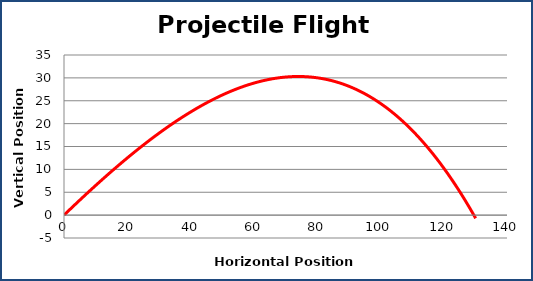
| Category | Position |
|---|---|
| 0.0 | 0 |
| 0.3653488391369297 | 0.243 |
| 0.7298941855221637 | 0.486 |
| 1.0936411116248594 | 0.727 |
| 1.456594636738926 | 0.968 |
| 1.818759727760791 | 1.207 |
| 2.1801412999525915 | 1.445 |
| 2.540744217691124 | 1.683 |
| 2.900573295202874 | 1.919 |
| 3.2596332972854447 | 2.155 |
| 3.617928940015685 | 2.389 |
| 3.975464891444821 | 2.623 |
| 4.332245772280883 | 2.855 |
| 4.6882761565586994 | 3.087 |
| 5.043560572297749 | 3.318 |
| 5.398103502148127 | 3.547 |
| 5.751909384024897 | 3.776 |
| 6.104982611731068 | 4.003 |
| 6.457327535569466 | 4.23 |
| 6.808948462943725 | 4.456 |
| 7.159849658948631 | 4.681 |
| 7.510035346950067 | 4.904 |
| 7.859509709154763 | 5.127 |
| 8.208276887170086 | 5.349 |
| 8.556340982554058 | 5.57 |
| 8.903706057355839 | 5.789 |
| 9.250376134646855 | 6.008 |
| 9.596355199042785 | 6.226 |
| 9.941647197216573 | 6.443 |
| 10.286256038402684 | 6.659 |
| 10.63018559489276 | 6.874 |
| 10.97343970252288 | 7.088 |
| 11.316022161152567 | 7.301 |
| 11.65793673513574 | 7.512 |
| 11.99918715378376 | 7.723 |
| 12.339777111820737 | 7.933 |
| 12.679710269831252 | 8.142 |
| 13.018990254700663 | 8.35 |
| 13.35762066004811 | 8.558 |
| 13.695605046652405 | 8.764 |
| 14.03294694287094 | 8.969 |
| 14.369649845051722 | 9.173 |
| 14.705717217938718 | 9.376 |
| 15.041152495070609 | 9.578 |
| 15.375959079173105 | 9.779 |
| 15.71014034254492 | 9.979 |
| 16.043699627437565 | 10.179 |
| 16.37664024642907 | 10.377 |
| 16.70896548279172 | 10.574 |
| 17.04067859085398 | 10.77 |
| 17.371782796356673 | 10.966 |
| 17.70228129680354 | 11.16 |
| 18.032177261806304 | 11.353 |
| 18.361473833424295 | 11.546 |
| 18.69017412649882 | 11.737 |
| 19.018281228982293 | 11.927 |
| 19.345798202262277 | 12.117 |
| 19.672728081480525 | 12.305 |
| 19.999073875847102 | 12.493 |
| 20.32483856894968 | 12.679 |
| 20.650025119058128 | 12.864 |
| 20.97463645942443 | 13.049 |
| 21.298675498578067 | 13.232 |
| 21.62214512061692 | 13.415 |
| 21.9450481854938 | 13.596 |
| 22.267387529298638 | 13.777 |
| 22.589165964536484 | 13.957 |
| 22.91038628040132 | 14.135 |
| 23.231051243045822 | 14.313 |
| 23.551163595847118 | 14.489 |
| 23.870726059668588 | 14.665 |
| 24.189741333117837 | 14.84 |
| 24.508212092800886 | 15.014 |
| 24.826140993572547 | 15.186 |
| 25.143530668783388 | 15.358 |
| 25.46038373052275 | 15.529 |
| 25.77670276985841 | 15.698 |
| 26.092490357073068 | 15.867 |
| 26.40774904189685 | 16.035 |
| 26.722481353736924 | 16.202 |
| 27.03668980190366 | 16.368 |
| 27.350376875833568 | 16.533 |
| 27.663545045309096 | 16.697 |
| 27.976196760675283 | 16.859 |
| 28.28833445305338 | 17.021 |
| 28.599960534551418 | 17.182 |
| 28.911077398471853 | 17.342 |
| 29.221687419516304 | 17.501 |
| 29.531792953987402 | 17.659 |
| 29.841396339987863 | 17.816 |
| 30.150499897616783 | 17.972 |
| 30.45910592916322 | 18.127 |
| 30.767216719297103 | 18.281 |
| 31.07483453525753 | 18.434 |
| 31.381961627038468 | 18.587 |
| 31.688600227571932 | 18.738 |
| 31.994752552908658 | 18.888 |
| 32.300420802396324 | 19.037 |
| 32.60560715885536 | 19.185 |
| 32.91031378875239 | 19.332 |
| 33.21454284237133 | 19.479 |
| 33.51829645398223 | 19.624 |
| 33.821576742007686 | 19.768 |
| 34.12438580918737 | 19.911 |
| 34.426725742740054 | 20.054 |
| 34.72859861452359 | 20.195 |
| 35.03000648119284 | 20.335 |
| 35.330951384355444 | 20.475 |
| 35.63143535072557 | 20.613 |
| 35.93146039227564 | 20.751 |
| 36.2310285063861 | 20.887 |
| 36.53014167599323 | 21.022 |
| 36.82880186973497 | 21.157 |
| 37.127011042094956 | 21.29 |
| 37.42477113354466 | 21.423 |
| 37.72208407068364 | 21.554 |
| 38.018951766378095 | 21.685 |
| 38.315376119897536 | 21.814 |
| 38.6113590170498 | 21.943 |
| 38.90690233031431 | 22.071 |
| 39.20200791897363 | 22.197 |
| 39.49667762924336 | 22.323 |
| 39.79091329440042 | 22.447 |
| 40.084716734909684 | 22.571 |
| 40.37808975854904 | 22.694 |
| 40.67103416053288 | 22.816 |
| 40.963551723634055 | 22.936 |
| 41.255644218304305 | 23.056 |
| 41.547313402793186 | 23.175 |
| 41.83856102326555 | 23.293 |
| 42.12938881391754 | 23.409 |
| 42.41979849709118 | 23.525 |
| 42.70979178338757 | 23.64 |
| 42.99937037177866 | 23.754 |
| 43.28853594971767 | 23.867 |
| 43.57729019324818 | 23.979 |
| 43.8656347671119 | 24.089 |
| 44.15357132485509 | 24.199 |
| 44.44110150893376 | 24.308 |
| 44.72822695081753 | 24.416 |
| 45.0149492710923 | 24.523 |
| 45.30127007956166 | 24.629 |
| 45.587190975347134 | 24.734 |
| 45.872713546987114 | 24.838 |
| 46.15783937253476 | 24.941 |
| 46.442570019654646 | 25.044 |
| 46.7269070457183 | 25.145 |
| 47.010851997898605 | 25.245 |
| 47.29440641326308 | 25.344 |
| 47.57757181886611 | 25.442 |
| 47.860349731840024 | 25.539 |
| 48.142741659485175 | 25.635 |
| 48.42474909935895 | 25.731 |
| 48.70637353936372 | 25.825 |
| 48.987616457833816 | 25.918 |
| 49.26847932362148 | 26.01 |
| 49.54896359618179 | 26.102 |
| 49.8290707256567 | 26.192 |
| 50.10880215295799 | 26.281 |
| 50.38815930984941 | 26.37 |
| 50.66714361902773 | 26.457 |
| 50.945756494203046 | 26.543 |
| 51.22399934017799 | 26.629 |
| 51.5018735529262 | 26.713 |
| 51.779380519669786 | 26.797 |
| 52.056521618956026 | 26.879 |
| 52.3332982207331 | 26.961 |
| 52.609711686425044 | 27.041 |
| 52.88576336900586 | 27.121 |
| 53.16145461307276 | 27.199 |
| 53.43678675491864 | 27.277 |
| 53.71176112260372 | 27.353 |
| 53.986379036026385 | 27.429 |
| 54.26064180699331 | 27.504 |
| 54.53455073928871 | 27.577 |
| 54.808107128742904 | 27.65 |
| 55.081312263300106 | 27.721 |
| 55.354167423085464 | 27.792 |
| 55.626673880471394 | 27.862 |
| 55.898832900143155 | 27.931 |
| 56.170645739163746 | 27.998 |
| 56.44211364703808 | 28.065 |
| 56.71323786577648 | 28.131 |
| 56.98401962995747 | 28.196 |
| 57.254460166789926 | 28.259 |
| 57.5245606961745 | 28.322 |
| 57.79432243076445 | 28.384 |
| 58.06374657602581 | 28.445 |
| 58.33283433029685 | 28.505 |
| 58.601586884847016 | 28.564 |
| 58.870005423935154 | 28.622 |
| 59.13809112486717 | 28.679 |
| 59.40584515805303 | 28.735 |
| 59.67326868706326 | 28.79 |
| 59.94036286868471 | 28.844 |
| 60.20712885297584 | 28.897 |
| 60.47356778332143 | 28.949 |
| 60.73968079648663 | 29 |
| 61.00546902267057 | 29.05 |
| 61.27093358555927 | 29.099 |
| 61.53607560237817 | 29.147 |
| 61.80089618394395 | 29.194 |
| 62.06539643471594 | 29.241 |
| 62.32957745284695 | 29.286 |
| 62.593440330233555 | 29.33 |
| 62.85698615256595 | 29.373 |
| 63.12021599937718 | 29.415 |
| 63.38313094409196 | 29.457 |
| 63.645732054074955 | 29.497 |
| 63.9080203906786 | 29.536 |
| 64.16999700929041 | 29.575 |
| 64.43166295937979 | 29.612 |
| 64.69301928454446 | 29.648 |
| 64.95406702255632 | 29.684 |
| 65.21480720540687 | 29.718 |
| 65.47524085935225 | 29.751 |
| 65.73536900495778 | 29.784 |
| 65.99519265714196 | 29.815 |
| 66.25471282522022 | 29.846 |
| 66.51393051294815 | 29.875 |
| 66.77284671856421 | 29.904 |
| 67.03146243483216 | 29.931 |
| 67.28977864908302 | 29.958 |
| 67.54779634325656 | 29.983 |
| 67.80551649394252 | 30.008 |
| 68.06294007242124 | 30.032 |
| 68.32006804470406 | 30.054 |
| 68.57690137157326 | 30.076 |
| 68.83344100862156 | 30.096 |
| 69.08968790629135 | 30.116 |
| 69.34564300991342 | 30.135 |
| 69.60130725974544 | 30.153 |
| 69.85668159100993 | 30.169 |
| 70.11176693393199 | 30.185 |
| 70.3665642137766 | 30.2 |
| 70.62107435088555 | 30.214 |
| 70.87529826071409 | 30.226 |
| 71.12923685386716 | 30.238 |
| 71.38289103613529 | 30.249 |
| 71.6362617085302 | 30.259 |
| 71.88934976731998 | 30.268 |
| 72.14215610406404 | 30.276 |
| 72.39468160564766 | 30.283 |
| 72.64692715431622 | 30.289 |
| 72.89889362770911 | 30.294 |
| 73.1505818988934 | 30.298 |
| 73.40199283639706 | 30.301 |
| 73.65312730424192 | 30.303 |
| 73.90398616197642 | 30.304 |
| 74.15457026470791 | 30.304 |
| 74.40488046313476 | 30.303 |
| 74.65491760357806 | 30.301 |
| 74.90468252801317 | 30.298 |
| 75.15417607410086 | 30.294 |
| 75.40339907521822 | 30.289 |
| 75.65235236048925 | 30.283 |
| 75.90103675481524 | 30.277 |
| 76.14945307890478 | 30.269 |
| 76.39760214930355 | 30.26 |
| 76.64548477842384 | 30.25 |
| 76.89310177457376 | 30.24 |
| 77.14045394198628 | 30.228 |
| 77.38754208084784 | 30.215 |
| 77.63436698732687 | 30.201 |
| 77.88092945360201 | 30.187 |
| 78.12723026788998 | 30.171 |
| 78.37327021447332 | 30.155 |
| 78.6190500737278 | 30.137 |
| 78.86457062214966 | 30.118 |
| 79.10983263238248 | 30.099 |
| 79.354836873244 | 30.078 |
| 79.59958410975251 | 30.057 |
| 79.84407510315316 | 30.034 |
| 80.08831061094388 | 30.011 |
| 80.33229138690123 | 29.986 |
| 80.57601818110594 | 29.961 |
| 80.81949173996819 | 29.934 |
| 81.06271280625275 | 29.907 |
| 81.30568211910385 | 29.879 |
| 81.54840041406986 | 29.849 |
| 81.79086842312772 | 29.819 |
| 82.03308687470717 | 29.788 |
| 82.27505649371476 | 29.755 |
| 82.51677800155774 | 29.722 |
| 82.75825211616755 | 29.688 |
| 82.99947955202335 | 29.652 |
| 83.24046102017509 | 29.616 |
| 83.48119722826664 | 29.579 |
| 83.72168888055847 | 29.541 |
| 83.96193667795039 | 29.502 |
| 84.20194131800383 | 29.461 |
| 84.44170349496414 | 29.42 |
| 84.68122389978262 | 29.378 |
| 84.92050322013834 | 29.335 |
| 85.1595421404598 | 29.291 |
| 85.39834134194642 | 29.246 |
| 85.6369015025898 | 29.2 |
| 85.87522329719485 | 29.153 |
| 86.11330739740075 | 29.105 |
| 86.35115447170166 | 29.056 |
| 86.58876518546735 | 29.006 |
| 86.82614020096355 | 28.955 |
| 87.06328017737223 | 28.903 |
| 87.30018577081168 | 28.85 |
| 87.53685763435634 | 28.796 |
| 87.77329641805663 | 28.741 |
| 88.00950276895844 | 28.685 |
| 88.2454773311226 | 28.629 |
| 88.4812207456441 | 28.571 |
| 88.71673365067113 | 28.512 |
| 88.95201668142411 | 28.452 |
| 89.1870704702144 | 28.391 |
| 89.4218956464629 | 28.33 |
| 89.65649283671858 | 28.267 |
| 89.89086266467676 | 28.203 |
| 90.12500575119725 | 28.138 |
| 90.35892271432242 | 28.073 |
| 90.59261416929503 | 28.006 |
| 90.82608072857597 | 27.939 |
| 91.05932300186186 | 27.87 |
| 91.29234159610242 | 27.8 |
| 91.52513711551785 | 27.73 |
| 91.75771016161593 | 27.658 |
| 91.99006133320907 | 27.586 |
| 92.22219122643116 | 27.512 |
| 92.45410043475437 | 27.438 |
| 92.68578954900566 | 27.362 |
| 92.91725915738337 | 27.286 |
| 93.14850984547351 | 27.208 |
| 93.37954219626599 | 27.13 |
| 93.61035679017067 | 27.05 |
| 93.84095420503338 | 26.97 |
| 94.0713350161517 | 26.889 |
| 94.30149979629071 | 26.806 |
| 94.53144911569854 | 26.723 |
| 94.7611835421218 | 26.639 |
| 94.99070364082101 | 26.553 |
| 95.22000997458574 | 26.467 |
| 95.4491031037497 | 26.38 |
| 95.67798358620581 | 26.292 |
| 95.90665197742094 | 26.203 |
| 96.13510883045072 | 26.112 |
| 96.36335469595417 | 26.021 |
| 96.59139012220822 | 25.929 |
| 96.8192156551221 | 25.836 |
| 97.0468318382516 | 25.742 |
| 97.27423921281334 | 25.647 |
| 97.50143831769873 | 25.551 |
| 97.728429689488 | 25.454 |
| 97.95521386246405 | 25.356 |
| 98.1817913686262 | 25.257 |
| 98.40816273770378 | 25.157 |
| 98.63432849716975 | 25.056 |
| 98.86028917225408 | 24.954 |
| 99.08604528595708 | 24.851 |
| 99.31159735906267 | 24.747 |
| 99.53694591015146 | 24.642 |
| 99.7620914556138 | 24.536 |
| 99.98703450966272 | 24.429 |
| 100.21177558434675 | 24.321 |
| 100.43631518956268 | 24.212 |
| 100.66065383306812 | 24.103 |
| 100.88479202049419 | 23.992 |
| 101.1087302553578 | 23.88 |
| 101.33246903907411 | 23.767 |
| 101.5560088709688 | 23.654 |
| 101.77935024829017 | 23.539 |
| 102.00249366622128 | 23.423 |
| 102.22543961789192 | 23.307 |
| 102.4481885943905 | 23.189 |
| 102.67074108477587 | 23.07 |
| 102.89309757608905 | 22.951 |
| 103.11525855336487 | 22.83 |
| 103.33722449964351 | 22.709 |
| 103.55899589598197 | 22.586 |
| 103.78057322146543 | 22.463 |
| 104.00195695321862 | 22.338 |
| 104.22314756641694 | 22.213 |
| 104.44414553429763 | 22.086 |
| 104.66495132817086 | 21.959 |
| 104.88556541743061 | 21.83 |
| 105.10598826956567 | 21.701 |
| 105.32622035017036 | 21.57 |
| 105.5462621229553 | 21.439 |
| 105.76611404975804 | 21.307 |
| 105.9857765905537 | 21.173 |
| 106.20525020346535 | 21.039 |
| 106.42453534477455 | 20.904 |
| 106.64363246893166 | 20.767 |
| 106.86254202856604 | 20.63 |
| 107.0812644744964 | 20.492 |
| 107.29980025574076 | 20.353 |
| 107.51814981952663 | 20.213 |
| 107.73631361130091 | 20.071 |
| 107.95429207473988 | 19.929 |
| 108.17208565175893 | 19.786 |
| 108.38969478252243 | 19.642 |
| 108.60711990545336 | 19.497 |
| 108.82436145724297 | 19.351 |
| 109.04141987286037 | 19.204 |
| 109.25829558556197 | 19.056 |
| 109.4749890269009 | 18.907 |
| 109.69150062673644 | 18.757 |
| 109.90783081324327 | 18.606 |
| 110.12398001292067 | 18.454 |
| 110.33994865060174 | 18.301 |
| 110.55573714946247 | 18.147 |
| 110.77134593103078 | 17.992 |
| 110.98677541519548 | 17.836 |
| 111.2020260202152 | 17.679 |
| 111.41709816272723 | 17.521 |
| 111.63199225775628 | 17.363 |
| 111.84670871872325 | 17.203 |
| 112.06124795745387 | 17.042 |
| 112.2756103841873 | 16.88 |
| 112.48979640758468 | 16.718 |
| 112.70380643473761 | 16.554 |
| 112.91764087117659 | 16.389 |
| 113.13130012087936 | 16.223 |
| 113.34478458627926 | 16.057 |
| 113.55809466827343 | 15.889 |
| 113.77123076623104 | 15.72 |
| 113.98419327800141 | 15.551 |
| 114.19698259992214 | 15.38 |
| 114.40959912682706 | 15.209 |
| 114.62204325205428 | 15.036 |
| 114.83431536745408 | 14.863 |
| 115.04641586339679 | 14.688 |
| 115.25834512878056 | 14.513 |
| 115.47010355103919 | 14.336 |
| 115.68169151614978 | 14.159 |
| 115.89310940864044 | 13.98 |
| 116.10435761159782 | 13.801 |
| 116.31543650667473 | 13.621 |
| 116.52634647409762 | 13.439 |
| 116.73708789267403 | 13.257 |
| 116.94766113979998 | 13.074 |
| 117.15806659146735 | 12.889 |
| 117.36830462227115 | 12.704 |
| 117.57837560541682 | 12.518 |
| 117.78827991272739 | 12.331 |
| 117.99801791465065 | 12.142 |
| 118.20758998026628 | 11.953 |
| 118.41699647729288 | 11.763 |
| 118.62623777209505 | 11.572 |
| 118.83531422969028 | 11.38 |
| 119.04422621375592 | 11.187 |
| 119.25297408663606 | 10.992 |
| 119.46155820934833 | 10.797 |
| 119.66997894159071 | 10.601 |
| 119.87823664174832 | 10.404 |
| 120.0863316669 | 10.206 |
| 120.29426437282508 | 10.007 |
| 120.50203511400997 | 9.807 |
| 120.70964424365467 | 9.606 |
| 120.91709211367933 | 9.404 |
| 121.12437907473077 | 9.201 |
| 121.33150547618885 | 8.998 |
| 121.53847166617294 | 8.793 |
| 121.74527799154822 | 8.587 |
| 121.95192479793205 | 8.38 |
| 122.15841242970018 | 8.172 |
| 122.36474122999303 | 7.963 |
| 122.5709115407219 | 7.754 |
| 122.77692370257508 | 7.543 |
| 122.98277805502399 | 7.331 |
| 123.18847493632926 | 7.118 |
| 123.39401468354674 | 6.905 |
| 123.59939763253355 | 6.69 |
| 123.80462411795398 | 6.474 |
| 124.00969447328546 | 6.258 |
| 124.21460903082442 | 6.04 |
| 124.41936812169213 | 5.822 |
| 124.62397207584054 | 5.602 |
| 124.82842122205803 | 5.381 |
| 125.03271588797514 | 5.16 |
| 125.2368564000703 | 4.937 |
| 125.44084308367545 | 4.714 |
| 125.6446762629817 | 4.49 |
| 125.84835626104494 | 4.264 |
| 126.05188339979135 | 4.038 |
| 126.25525800002295 | 3.81 |
| 126.45848038142309 | 3.582 |
| 126.66155086256188 | 3.353 |
| 126.86446976090164 | 3.122 |
| 127.06723739280228 | 2.891 |
| 127.26985407352664 | 2.659 |
| 127.4723201172458 | 2.425 |
| 127.67463583704438 | 2.191 |
| 127.8768015449258 | 1.956 |
| 128.07881755181748 | 1.72 |
| 128.28068416757606 | 1.482 |
| 128.48240170099248 | 1.244 |
| 128.68397045979722 | 1.005 |
| 128.88539075066532 | 0.765 |
| 129.0866628792214 | 0.524 |
| 129.28778715004478 | 0.282 |
| 129.48876386667442 | 0.039 |
| 129.68959333161393 | -0.205 |
| 129.89027584633646 | -0.45 |
| 130.09081171128963 | -0.696 |